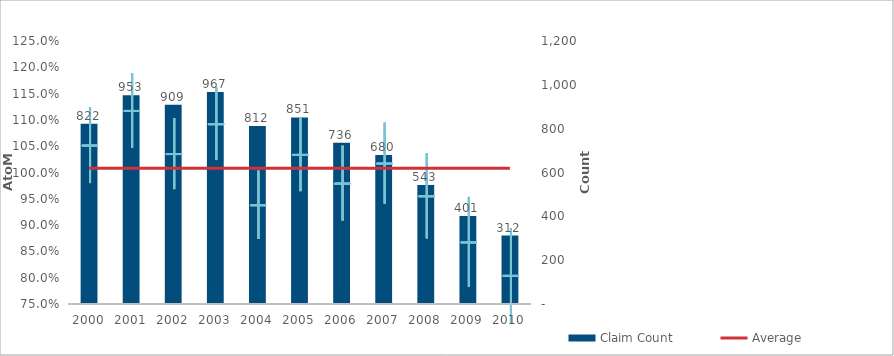
| Category | Claim Count |
|---|---|
| 0 | 822 |
| 1 | 953 |
| 2 | 909 |
| 3 | 967 |
| 4 | 812 |
| 5 | 851 |
| 6 | 736 |
| 7 | 680 |
| 8 | 543 |
| 9 | 401 |
| 10 | 312 |